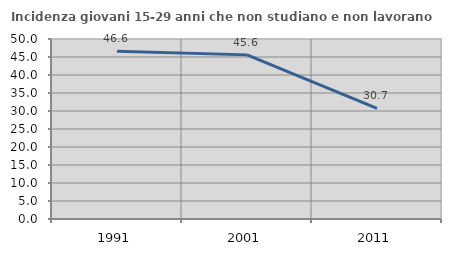
| Category | Incidenza giovani 15-29 anni che non studiano e non lavorano  |
|---|---|
| 1991.0 | 46.625 |
| 2001.0 | 45.59 |
| 2011.0 | 30.707 |